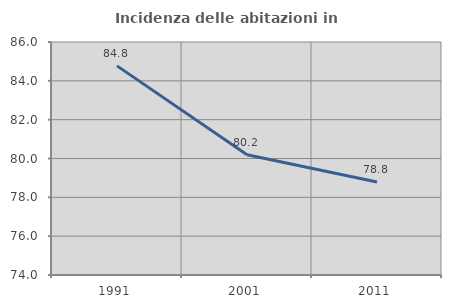
| Category | Incidenza delle abitazioni in proprietà  |
|---|---|
| 1991.0 | 84.77 |
| 2001.0 | 80.192 |
| 2011.0 | 78.79 |